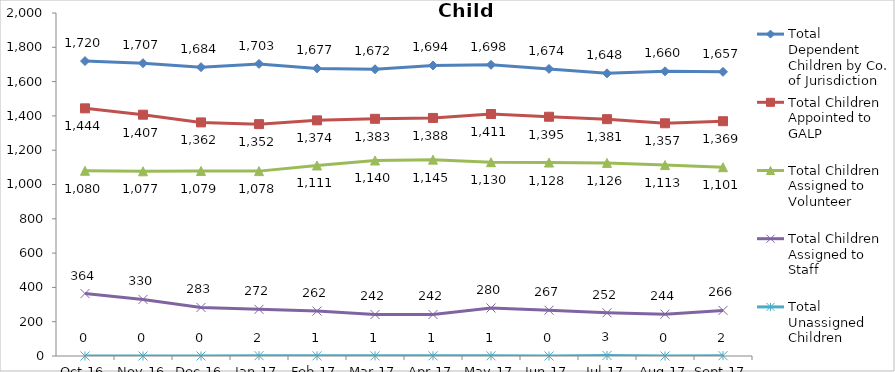
| Category | Total Dependent Children by Co. of Jurisdiction | Total Children Appointed to GALP | Total Children Assigned to Volunteer | Total Children Assigned to Staff | Total Unassigned Children |
|---|---|---|---|---|---|
| 2016-10-01 | 1720 | 1444 | 1080 | 364 | 0 |
| 2016-11-01 | 1707 | 1407 | 1077 | 330 | 0 |
| 2016-12-01 | 1684 | 1362 | 1079 | 283 | 0 |
| 2017-01-01 | 1703 | 1352 | 1078 | 272 | 2 |
| 2017-02-01 | 1677 | 1374 | 1111 | 262 | 1 |
| 2017-03-01 | 1672 | 1383 | 1140 | 242 | 1 |
| 2017-04-01 | 1694 | 1388 | 1145 | 242 | 1 |
| 2017-05-01 | 1698 | 1411 | 1130 | 280 | 1 |
| 2017-06-01 | 1674 | 1395 | 1128 | 267 | 0 |
| 2017-07-01 | 1648 | 1381 | 1126 | 252 | 3 |
| 2017-08-01 | 1660 | 1357 | 1113 | 244 | 0 |
| 2017-09-01 | 1657 | 1369 | 1101 | 266 | 2 |